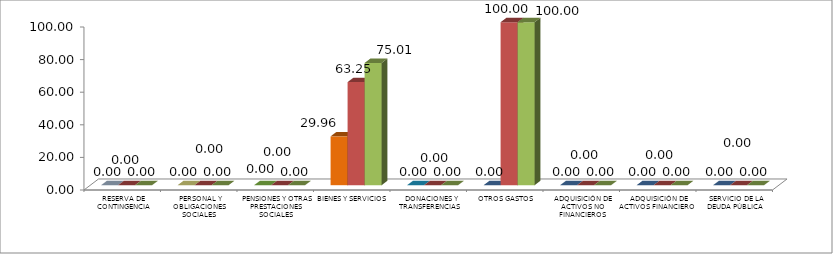
| Category | 1er Trimestre | 2do Trimestre | 3er Trimestre |
|---|---|---|---|
|  RESERVA DE CONTINGENCIA | 0 | 0 | 0 |
|  PERSONAL Y OBLIGACIONES SOCIALES | 0 | 0 | 0 |
|  PENSIONES Y OTRAS PRESTACIONES SOCIALES | 0 | 0 | 0 |
|  BIENES Y SERVICIOS | 29.964 | 63.246 | 75.008 |
|   DONACIONES Y TRANSFERENCIAS | 0 | 0 | 0 |
|  OTROS GASTOS | 0 | 100 | 100 |
|  ADQUISICIÓN DE ACTIVOS NO FINANCIEROS | 0 | 0 | 0 |
|  ADQUISICIÓN DE ACTIVOS FINANCIEROS | 0 | 0 | 0 |
|  SERVICIO DE LA DEUDA PÚBLICA | 0 | 0 | 0 |